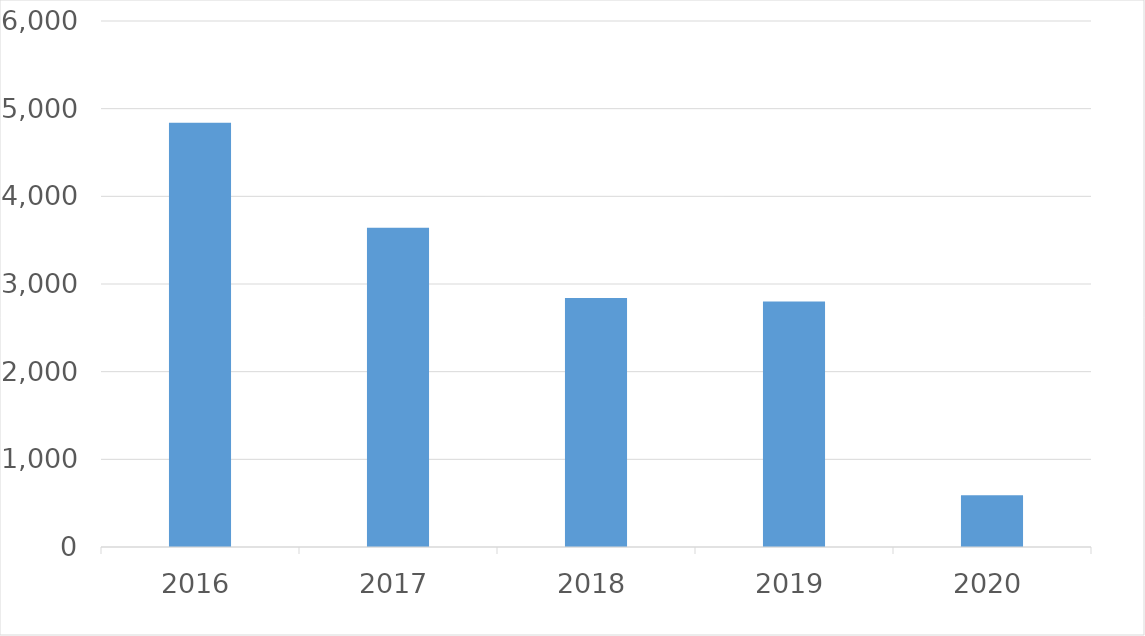
| Category | Series 0 |
|---|---|
| 2016 | 4839 |
| 2017 | 3643 |
| 2018 | 2841 |
| 2019 | 2801 |
| 2020 | 591 |